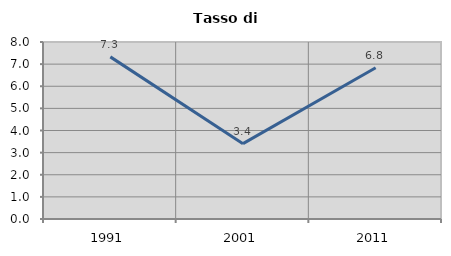
| Category | Tasso di disoccupazione   |
|---|---|
| 1991.0 | 7.328 |
| 2001.0 | 3.404 |
| 2011.0 | 6.837 |